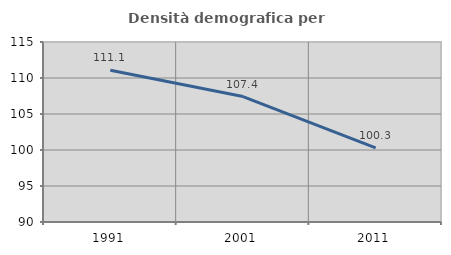
| Category | Densità demografica |
|---|---|
| 1991.0 | 111.075 |
| 2001.0 | 107.422 |
| 2011.0 | 100.283 |